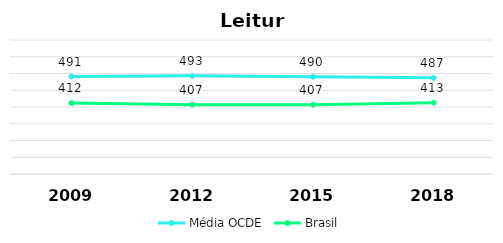
| Category | Média OCDE | Brasil |
|---|---|---|
| 2009.0 | 491 | 412 |
| 2012.0 | 493 | 407 |
| 2015.0 | 490 | 407 |
| 2018.0 | 487 | 413 |